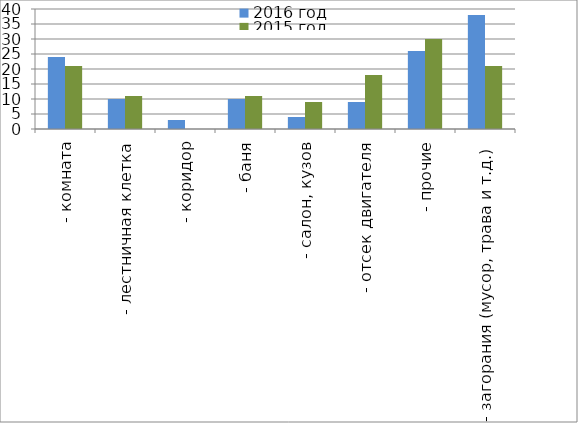
| Category | 2016 год | 2015 год |
|---|---|---|
|  - комната | 24 | 21 |
|  - лестничная клетка | 10 | 11 |
|  - коридор | 3 | 0 |
|  - баня | 10 | 11 |
|  - салон, кузов | 4 | 9 |
|  - отсек двигателя | 9 | 18 |
| - прочие | 26 | 30 |
| - загорания (мусор, трава и т.д.)  | 38 | 21 |